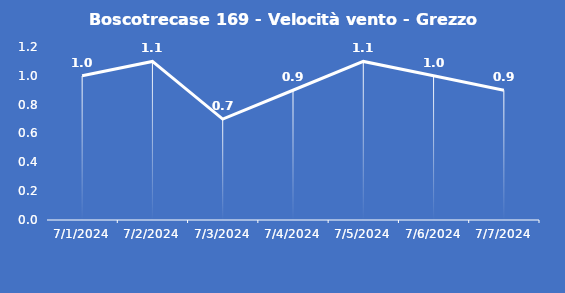
| Category | Boscotrecase 169 - Velocità vento - Grezzo (m/s) |
|---|---|
| 7/1/24 | 1 |
| 7/2/24 | 1.1 |
| 7/3/24 | 0.7 |
| 7/4/24 | 0.9 |
| 7/5/24 | 1.1 |
| 7/6/24 | 1 |
| 7/7/24 | 0.9 |